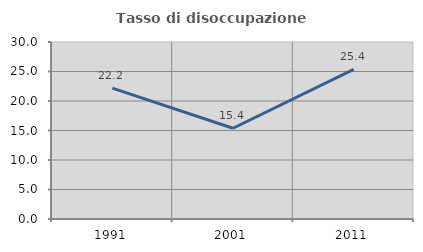
| Category | Tasso di disoccupazione giovanile  |
|---|---|
| 1991.0 | 22.179 |
| 2001.0 | 15.385 |
| 2011.0 | 25.359 |